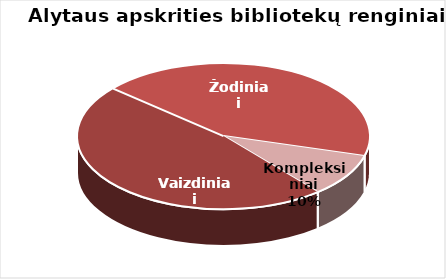
| Category | Series 0 |
|---|---|
| Vaizdiniai | 1450 |
| Žodiniai | 1316 |
| Kompleksiniai | 291 |